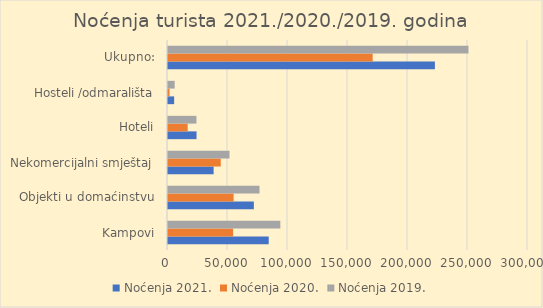
| Category | Noćenja 2021. | Noćenja 2020. | Noćenja 2019. |
|---|---|---|---|
| Kampovi | 83940 | 54268 | 93617 |
| Objekti u domaćinstvu | 71559 | 54678 | 76261 |
| Nekomercijalni smještaj | 38020 | 43960 | 51243 |
| Hoteli | 23769 | 16384 | 23694 |
| Hosteli /odmarališta | 5121 | 1282 | 5562 |
| Ukupno: | 222409 | 170572 | 250377 |